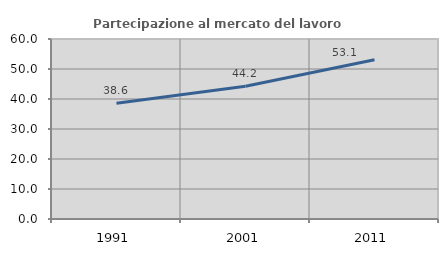
| Category | Partecipazione al mercato del lavoro  femminile |
|---|---|
| 1991.0 | 38.596 |
| 2001.0 | 44.236 |
| 2011.0 | 53.065 |